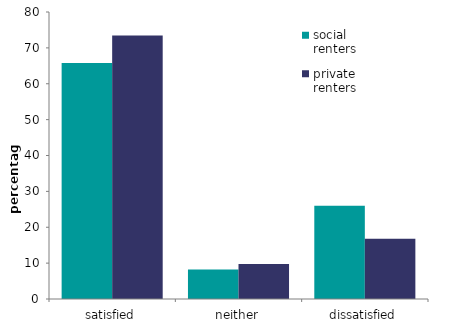
| Category | social renters | private renters |
|---|---|---|
| satisfied | 65.8 | 73.449 |
| neither | 8.211 | 9.758 |
| dissatisfied | 25.989 | 16.8 |